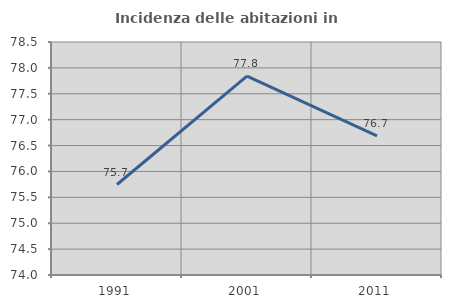
| Category | Incidenza delle abitazioni in proprietà  |
|---|---|
| 1991.0 | 75.748 |
| 2001.0 | 77.843 |
| 2011.0 | 76.687 |